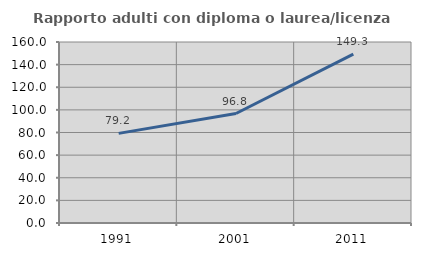
| Category | Rapporto adulti con diploma o laurea/licenza media  |
|---|---|
| 1991.0 | 79.221 |
| 2001.0 | 96.794 |
| 2011.0 | 149.266 |